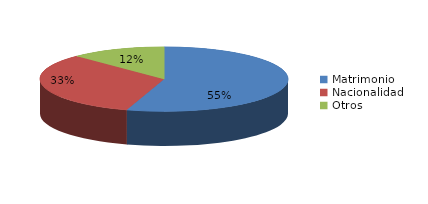
| Category | Series 0 |
|---|---|
| Matrimonio | 6584 |
| Nacionalidad | 3935 |
| Otros | 1489 |